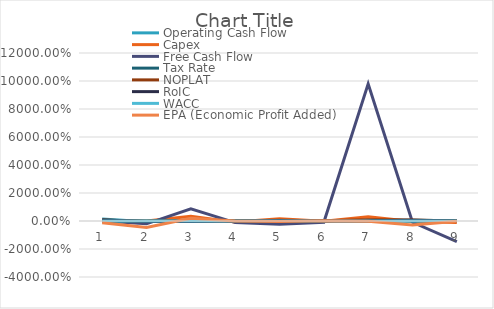
| Category | Operating Cash Flow | Capex | Free Cash Flow | Tax Rate | NOPLAT | RoIC | WACC | EPA (Economic Profit Added) |
|---|---|---|---|---|---|---|---|---|
| 0 | 1.39 | 0 | 0 | -0.15 | 0.789 | 0.635 | 0 | -1.264 |
| 1 | -0.476 | 0.037 | -2.026 | 0.006 | -0.174 | -0.306 | 0 | -4.626 |
| 2 | 0.854 | 3.445 | 8.763 | 0.032 | 0.039 | -0.319 | 0 | 1.997 |
| 3 | 0.128 | -0.796 | -1.156 | 0.285 | 0.052 | 0.01 | 0 | 0.031 |
| 4 | 0.219 | 1.622 | -2.328 | -0.094 | 0.604 | 0.404 | 0 | -0.349 |
| 5 | 0.094 | -0.191 | -0.93 | -0.065 | 0.109 | -0.026 | 0 | 0.218 |
| 6 | 0.645 | 3.003 | 97.972 | -0.075 | 0.809 | 0.202 | 0 | -0.223 |
| 7 | 0.593 | -0.304 | -0.904 | -0.071 | 0.779 | 0.455 | 0 | -2.874 |
| 8 | 0.215 | -1.022 | -14.744 | 0.128 | -0.077 | -0.02 | 0 | -0.157 |